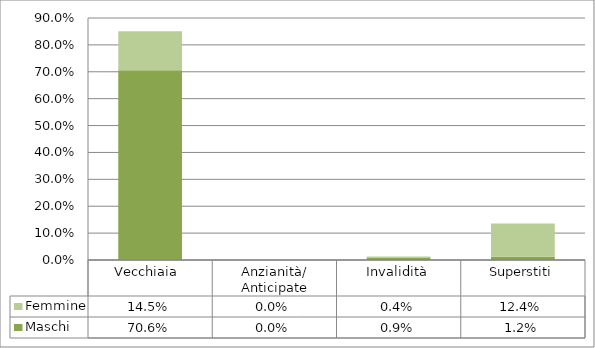
| Category | Maschi | Femmine |
|---|---|---|
| Vecchiaia  | 0.706 | 0.145 |
| Anzianità/ Anticipate | 0 | 0 |
| Invalidità | 0.009 | 0.004 |
| Superstiti | 0.012 | 0.124 |